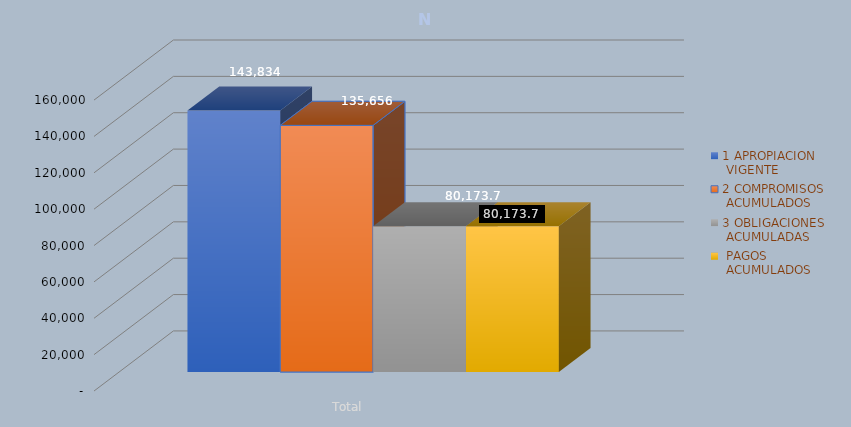
| Category | 1 APROPIACION
 VIGENTE | 2 COMPROMISOS
 ACUMULADOS | 3 OBLIGACIONES
 ACUMULADAS |  PAGOS
 ACUMULADOS |
|---|---|---|---|---|
| Total | 143833.689 | 135656.159 | 80173.668 | 80173.668 |